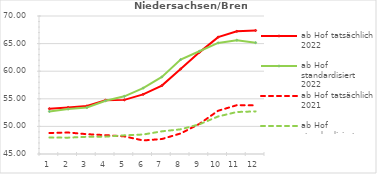
| Category | ab Hof tatsächlich 2022 | ab Hof standardisiert 2022 | ab Hof tatsächlich 2021 | ab Hof standardisiert 2021 |
|---|---|---|---|---|
| 0 | 53.209 | 52.708 | 48.809 | 47.982 |
| 1 | 53.426 | 53.134 | 48.89 | 47.963 |
| 2 | 53.693 | 53.415 | 48.591 | 48.118 |
| 3 | 54.744 | 54.649 | 48.414 | 48.148 |
| 4 | 54.805 | 55.45 | 48.19 | 48.381 |
| 5 | 55.807 | 56.941 | 47.456 | 48.531 |
| 6 | 57.399 | 58.96 | 47.708 | 49.106 |
| 7 | 60.383 | 62.104 | 48.724 | 49.471 |
| 8 | 63.411 | 63.609 | 50.451 | 50.377 |
| 9 | 66.173 | 65.121 | 52.834 | 51.799 |
| 10 | 67.225 | 65.622 | 53.846 | 52.609 |
| 11 | 67.375 | 65.166 | 53.807 | 52.718 |